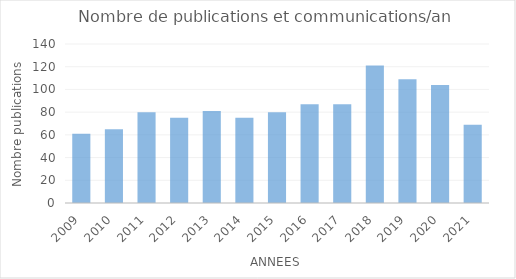
| Category | Series 0 |
|---|---|
| 2009.0 | 61 |
| 2010.0 | 65 |
| 2011.0 | 80 |
| 2012.0 | 75 |
| 2013.0 | 81 |
| 2014.0 | 75 |
| 2015.0 | 80 |
| 2016.0 | 87 |
| 2017.0 | 87 |
| 2018.0 | 121 |
| 2019.0 | 109 |
| 2020.0 | 104 |
| 2021.0 | 69 |